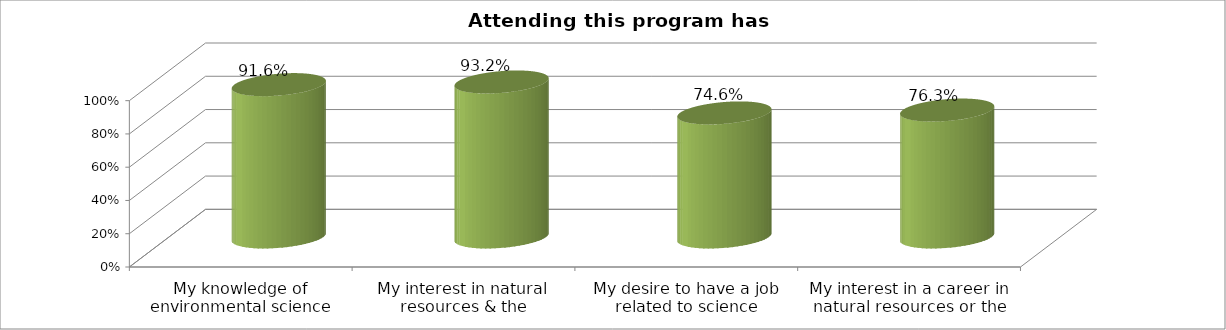
| Category | Campers (N=59) |
|---|---|
| My knowledge of environmental science | 0.916 |
| My interest in natural resources & the environment | 0.932 |
| My desire to have a job related to science | 0.746 |
| My interest in a career in natural resources or the environment | 0.763 |